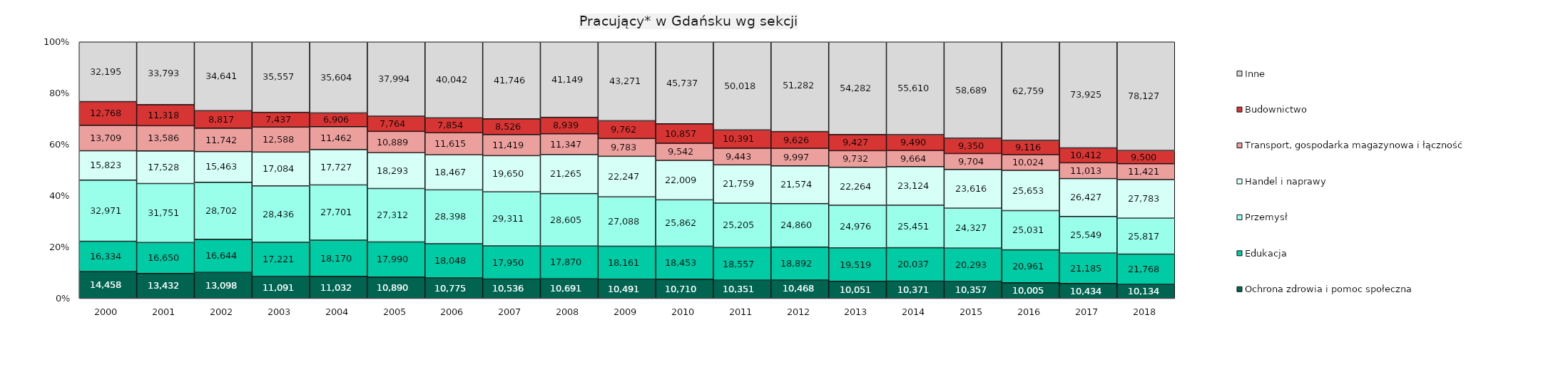
| Category | Ochrona zdrowia i pomoc społeczna | Edukacja | Przemysł | Handel i naprawy | Transport, gospodarka magazynowa i łączność | Budownictwo | Inne |
|---|---|---|---|---|---|---|---|
| 2000.0 | 14458 | 16334 | 32971 | 15823 | 13709 | 12768 | 32195 |
| 2001.0 | 13432 | 16650 | 31751 | 17528 | 13586 | 11318 | 33793 |
| 2002.0 | 13098 | 16644 | 28702 | 15463 | 11742 | 8817 | 34641 |
| 2003.0 | 11091 | 17221 | 28436 | 17084 | 12588 | 7437 | 35557 |
| 2004.0 | 11032 | 18170 | 27701 | 17727 | 11462 | 6906 | 35604 |
| 2005.0 | 10890 | 17990 | 27312 | 18293 | 10889 | 7764 | 37994 |
| 2006.0 | 10775 | 18048 | 28398 | 18467 | 11615 | 7854 | 40042 |
| 2007.0 | 10536 | 17950 | 29311 | 19650 | 11419 | 8526 | 41746 |
| 2008.0 | 10691 | 17870 | 28605 | 21265 | 11347 | 8939 | 41149 |
| 2009.0 | 10491 | 18161 | 27088 | 22247 | 9783 | 9762 | 43271 |
| 2010.0 | 10710 | 18453 | 25862 | 22009 | 9542 | 10857 | 45737 |
| 2011.0 | 10351 | 18557 | 25205 | 21759 | 9443 | 10391 | 50018 |
| 2012.0 | 10468 | 18892 | 24860 | 21574 | 9997 | 9626 | 51282 |
| 2013.0 | 10051 | 19519 | 24976 | 22264 | 9732 | 9427 | 54282 |
| 2014.0 | 10371 | 20037 | 25451 | 23124 | 9664 | 9490 | 55610 |
| 2015.0 | 10357 | 20293 | 24327 | 23616 | 9704 | 9350 | 58689 |
| 2016.0 | 10005 | 20961 | 25031 | 25653 | 10024 | 9116 | 62759 |
| 2017.0 | 10434 | 21185 | 25549 | 26427 | 11013 | 10412 | 73925 |
| 2018.0 | 10134 | 21768 | 25817 | 27783 | 11421 | 9500 | 78127 |